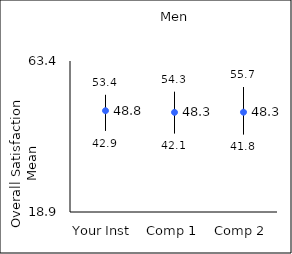
| Category | 25th percentile | 75th percentile | Mean |
|---|---|---|---|
| Your Inst | 42.9 | 53.4 | 48.75 |
| Comp 1 | 42.1 | 54.3 | 48.27 |
| Comp 2 | 41.8 | 55.7 | 48.31 |